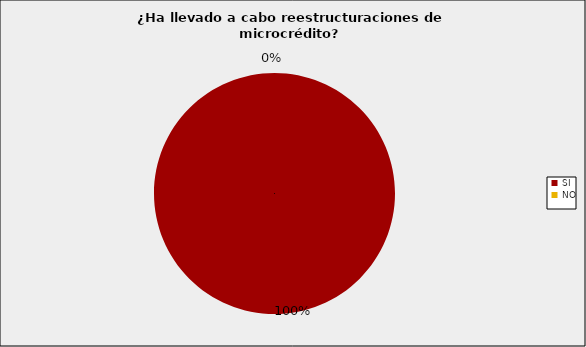
| Category | Entidades Supervisadas SFC |
|---|---|
| SI | 1 |
| NO | 0 |